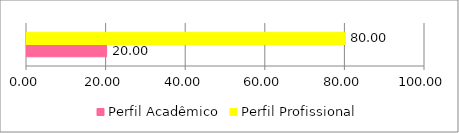
| Category | Perfil Acadêmico | Perfil Profissional |
|---|---|---|
| 0 | 20 | 80 |